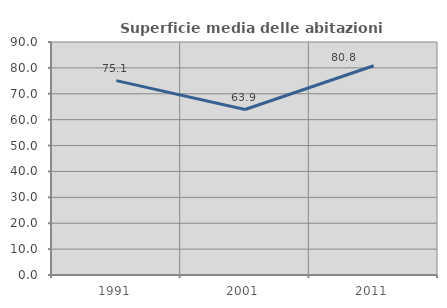
| Category | Superficie media delle abitazioni occupate |
|---|---|
| 1991.0 | 75.081 |
| 2001.0 | 63.912 |
| 2011.0 | 80.819 |